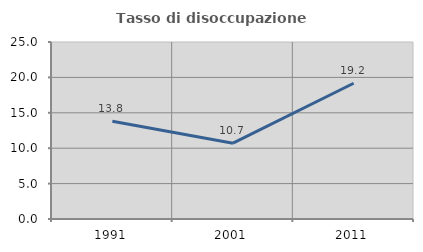
| Category | Tasso di disoccupazione giovanile  |
|---|---|
| 1991.0 | 13.814 |
| 2001.0 | 10.706 |
| 2011.0 | 19.173 |